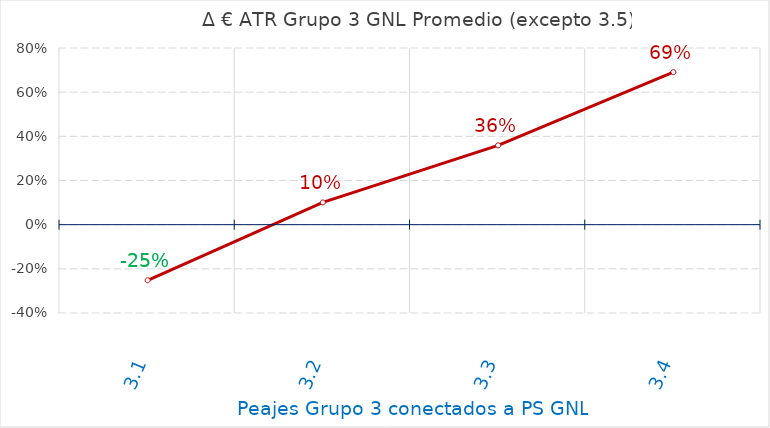
| Category | D €/año |
|---|---|
| 3.1 | -0.252 |
| 3.2 | 0.101 |
| 3.3 | 0.359 |
| 3.4 | 0.691 |